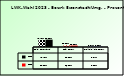
| Category | 2018 | 2023 |
|---|---|---|
| Bgld. Bauernbund | 0.787 | 0.818 |
| SPÖ Bauern | 0.182 | 0.161 |
| Freiheitliche Bauern | 0.031 | 0.021 |